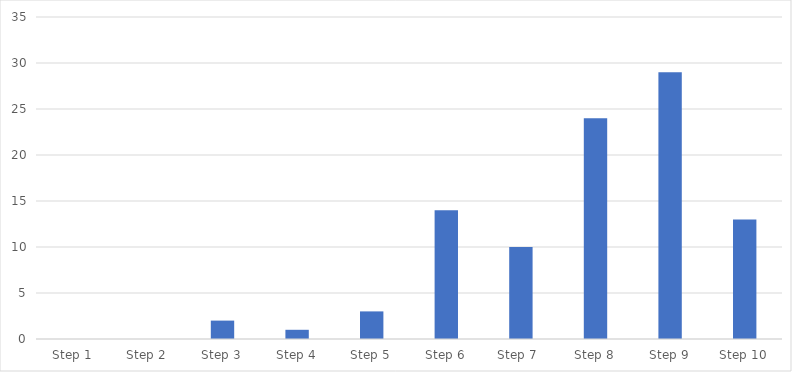
| Category | Number of Responses |
|---|---|
| Step 1 | 0 |
| Step 2 | 0 |
| Step 3 | 2 |
| Step 4 | 1 |
| Step 5 | 3 |
| Step 6 | 14 |
| Step 7  | 10 |
| Step 8 | 24 |
| Step 9 | 29 |
| Step 10 | 13 |